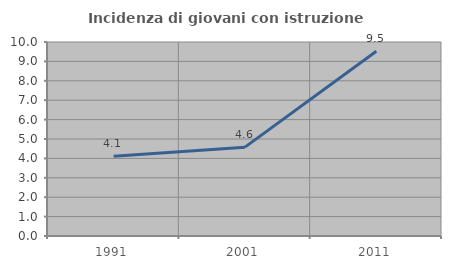
| Category | Incidenza di giovani con istruzione universitaria |
|---|---|
| 1991.0 | 4.11 |
| 2001.0 | 4.58 |
| 2011.0 | 9.524 |